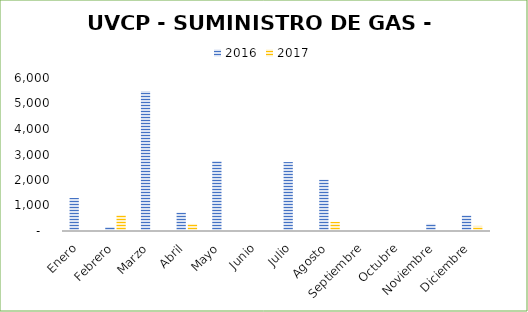
| Category | 2016 | 2017 |
|---|---|---|
| Enero | 1295 | 5 |
| Febrero | 157 | 621 |
| Marzo | 5495 | 0 |
| Abril | 723 | 278 |
| Mayo | 2746 | 0 |
| Junio | 0 | 0 |
| Julio | 2703 | 0 |
| Agosto | 2014 | 360 |
| Septiembre | 6 | 0 |
| Octubre | 0 | 5 |
| Noviembre | 281 | 0 |
| Diciembre | 616 | 200 |